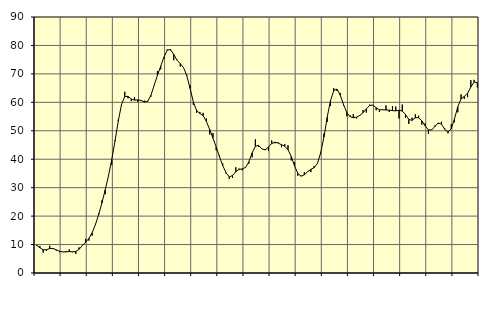
| Category | Piggar | Series 1 |
|---|---|---|
| nan | 9.5 | 9.77 |
| 87.0 | 9.5 | 8.88 |
| 87.0 | 7.2 | 8.17 |
| 87.0 | 7.8 | 8.17 |
| nan | 9.6 | 8.6 |
| 88.0 | 8.4 | 8.66 |
| 88.0 | 7.9 | 8.16 |
| 88.0 | 7.3 | 7.64 |
| nan | 7.5 | 7.4 |
| 89.0 | 7.3 | 7.47 |
| 89.0 | 8.3 | 7.54 |
| 89.0 | 7.3 | 7.45 |
| nan | 6.7 | 7.58 |
| 90.0 | 9 | 8.34 |
| 90.0 | 9.7 | 9.63 |
| 90.0 | 12 | 10.82 |
| nan | 11.4 | 12.14 |
| 91.0 | 13.1 | 14.15 |
| 91.0 | 17.2 | 16.98 |
| 91.0 | 21 | 20.53 |
| nan | 25.5 | 24.63 |
| 92.0 | 27.7 | 29.2 |
| 92.0 | 34.3 | 34.16 |
| 92.0 | 38 | 39.82 |
| nan | 46.7 | 46.35 |
| 93.0 | 53.9 | 53.38 |
| 93.0 | 58.7 | 59.24 |
| 93.0 | 63.7 | 62.02 |
| nan | 61.4 | 62.11 |
| 94.0 | 60.4 | 61.18 |
| 94.0 | 61.8 | 60.77 |
| 94.0 | 60.2 | 60.88 |
| nan | 60.8 | 60.64 |
| 95.0 | 60.6 | 60.13 |
| 95.0 | 60.5 | 60.33 |
| 95.0 | 62 | 62.44 |
| nan | 65.9 | 65.99 |
| 96.0 | 71 | 69.5 |
| 96.0 | 71.6 | 72.68 |
| 96.0 | 75.4 | 75.91 |
| nan | 78.6 | 78.34 |
| 97.0 | 78.3 | 78.59 |
| 97.0 | 74.8 | 76.85 |
| 97.0 | 75 | 74.83 |
| nan | 72.6 | 73.58 |
| 98.0 | 72.3 | 72.22 |
| 98.0 | 69.6 | 69.35 |
| 98.0 | 66 | 64.94 |
| nan | 59.1 | 60.13 |
| 99.0 | 56.3 | 57.14 |
| 99.0 | 56.6 | 56.12 |
| 99.0 | 56.3 | 55.31 |
| nan | 54.3 | 53.27 |
| 0.0 | 48.7 | 50.46 |
| 0.0 | 49.2 | 47.44 |
| 0.0 | 43.1 | 44.29 |
| nan | 41.3 | 40.9 |
| 1.0 | 38.5 | 37.79 |
| 1.0 | 35 | 35.26 |
| 1.0 | 33.1 | 33.81 |
| nan | 33.4 | 34.27 |
| 2.0 | 37.2 | 35.61 |
| 2.0 | 36.7 | 36.43 |
| 2.0 | 36.1 | 36.6 |
| nan | 37.2 | 37.12 |
| 3.0 | 38.4 | 39.1 |
| 3.0 | 40.7 | 42.17 |
| 3.0 | 47 | 44.57 |
| nan | 44.3 | 44.83 |
| 4.0 | 43.7 | 43.65 |
| 4.0 | 43.6 | 43.26 |
| 4.0 | 43 | 44.25 |
| nan | 46.6 | 45.49 |
| 5.0 | 45.6 | 46.01 |
| 5.0 | 45.9 | 45.67 |
| 5.0 | 44.2 | 45.1 |
| nan | 45.3 | 44.55 |
| 6.0 | 44.9 | 43.35 |
| 6.0 | 39.6 | 40.95 |
| 6.0 | 39 | 37.66 |
| nan | 34.2 | 35.03 |
| 7.0 | 34.2 | 34.03 |
| 7.0 | 35.4 | 34.53 |
| 7.0 | 35.5 | 35.61 |
| nan | 35.5 | 36.44 |
| 8.0 | 37.6 | 37.04 |
| 8.0 | 38.6 | 38.52 |
| 8.0 | 42.3 | 42.19 |
| nan | 49 | 47.79 |
| 9.0 | 53.1 | 54.73 |
| 9.0 | 58.7 | 60.56 |
| 9.0 | 65 | 64.09 |
| nan | 64 | 64.67 |
| 10.0 | 63.3 | 62.5 |
| 10.0 | 58.9 | 59.26 |
| 10.0 | 55.1 | 56.45 |
| nan | 55.4 | 54.96 |
| 11.0 | 55.9 | 54.59 |
| 11.0 | 54.3 | 54.8 |
| 11.0 | 55.3 | 55.41 |
| nan | 57.3 | 56.36 |
| 12.0 | 56.4 | 57.69 |
| 12.0 | 59.2 | 58.89 |
| 12.0 | 59.1 | 59.03 |
| nan | 57.2 | 58.09 |
| 13.0 | 56.6 | 57.39 |
| 13.0 | 57.5 | 57.37 |
| 13.0 | 58.9 | 57.3 |
| nan | 56.6 | 57.28 |
| 14.0 | 58.7 | 57.08 |
| 14.0 | 58.5 | 57 |
| 14.0 | 54.3 | 57.23 |
| nan | 59.2 | 56.94 |
| 15.0 | 54.5 | 55.71 |
| 15.0 | 52.4 | 54.01 |
| 15.0 | 54.6 | 53.67 |
| nan | 55.8 | 54.56 |
| 16.0 | 55.3 | 54.6 |
| 16.0 | 52.2 | 53.49 |
| 16.0 | 52.6 | 51.73 |
| nan | 48.9 | 50.32 |
| 17.0 | 50.4 | 50.3 |
| 17.0 | 51.9 | 51.53 |
| 17.0 | 52.5 | 52.75 |
| nan | 53.2 | 52.33 |
| 18.0 | 50.8 | 50.53 |
| 18.0 | 49.1 | 49.55 |
| 18.0 | 52.3 | 50.74 |
| nan | 53 | 54.23 |
| 19.0 | 56.5 | 58.44 |
| 19.0 | 62.8 | 61.17 |
| 19.0 | 61.2 | 62.11 |
| nan | 61.8 | 63.17 |
| 20.0 | 67.8 | 65.4 |
| 20.0 | 67.9 | 67.15 |
| 20.0 | 65.2 | 66.9 |